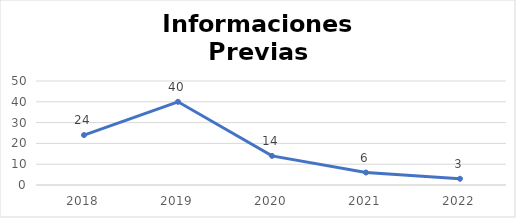
| Category | Informaciones Previas |
|---|---|
| 2018.0 | 24 |
| 2019.0 | 40 |
| 2020.0 | 14 |
| 2021.0 | 6 |
| 2022.0 | 3 |